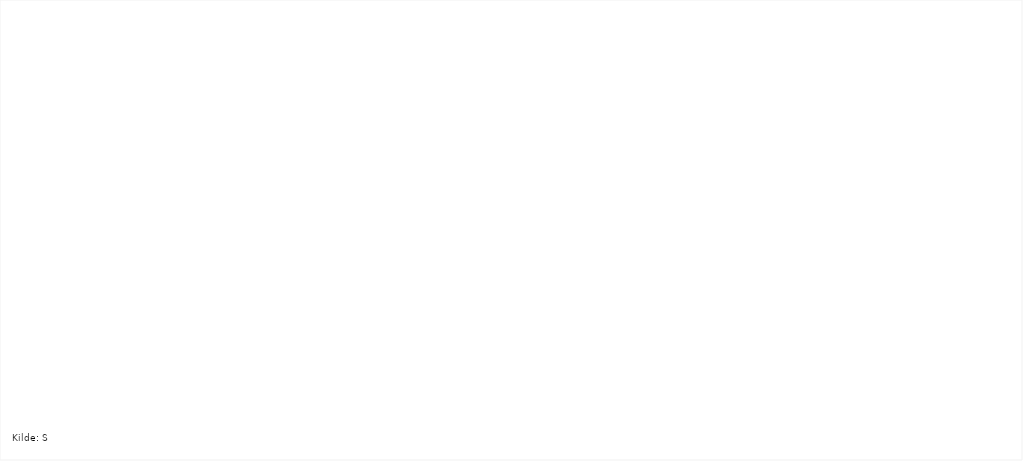
| Category | dyrka | dyrkbar |
|---|---|---|
| 2005 | 828 | 674 |
| 2006 | 1113 | 588 |
| 2007 | 933 | 535 |
| 2008 | 1536 | 573 |
| 2009 | 1474 | 362 |
| 2010 | 991 | 430 |
| 2011 | 924 | 343 |
| 2012 | 1229 | 377 |
| 2013 | 676 | 1035 |
| 2014 | 685 | 872 |
| 2015 | 1590 | 530 |
| 2016 | 1917 | 641 |
| 2017 | 853 | 341 |
| 2018 | 509 | 490 |
| 2019 | 597 | 308 |